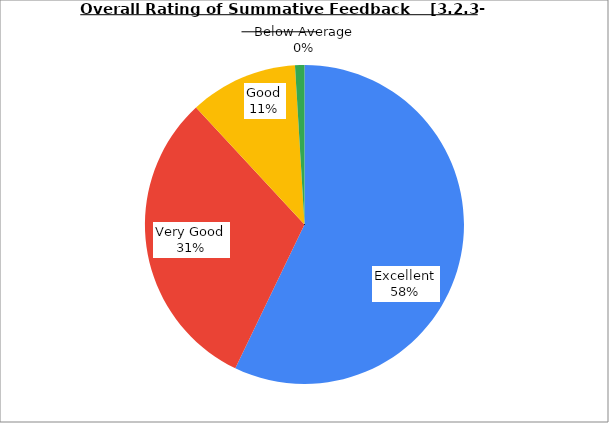
| Category | Series 0 |
|---|---|
| Excellent | 57.143 |
| Very Good | 30.952 |
| Good | 10.952 |
| Average | 0.952 |
| Below Average | 0 |